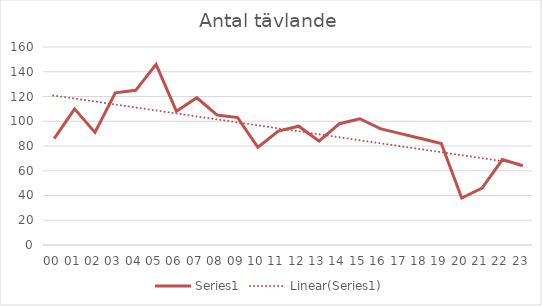
| Category | Series 1 |
|---|---|
| 00 | 86 |
| 01 | 110 |
| 02 | 91 |
| 03 | 123 |
| 04 | 125 |
| 05 | 146 |
| 06 | 108 |
| 07 | 119 |
| 08 | 105 |
| 09 | 103 |
| 10 | 79 |
| 11 | 92 |
| 12 | 96 |
| 13 | 84 |
| 14 | 98 |
| 15 | 102 |
| 16 | 94 |
| 17 | 90 |
| 18 | 86 |
| 19 | 82 |
| 20 | 38 |
| 21 | 46 |
| 22 | 69 |
| 23 | 64 |